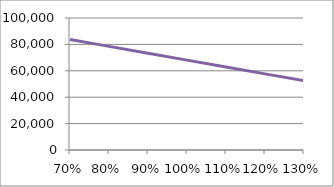
| Category | Series 3 |
|---|---|
| 0.7 | 83739.307 |
| 0.8 | 78495.801 |
| 0.9 | 73313.456 |
| 1.0 | 68097.938 |
| 1.1 | 62849.843 |
| 1.2 | 57666.372 |
| 1.3 | 52441.099 |